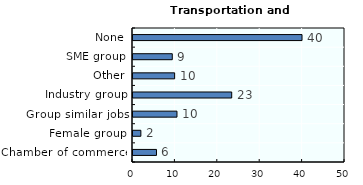
| Category | Transportation and storage |
|---|---|
| Chamber of commerce | 5.542 |
| Female group | 1.856 |
| Group similar jobs | 10.371 |
| Industry group | 23.281 |
| Other | 9.819 |
| SME group | 9.267 |
| None | 39.864 |